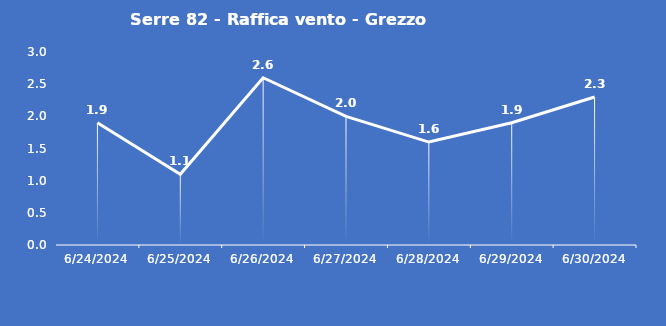
| Category | Serre 82 - Raffica vento - Grezzo (m/s) |
|---|---|
| 6/24/24 | 1.9 |
| 6/25/24 | 1.1 |
| 6/26/24 | 2.6 |
| 6/27/24 | 2 |
| 6/28/24 | 1.6 |
| 6/29/24 | 1.9 |
| 6/30/24 | 2.3 |